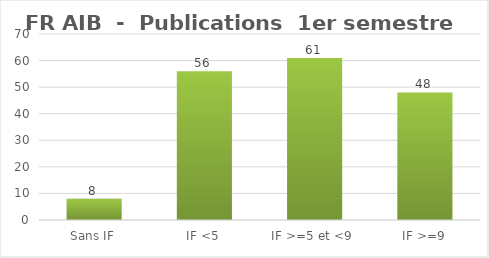
| Category | Series 0 |
|---|---|
| Sans IF | 8 |
| IF <5 | 56 |
| IF >=5 et <9  | 61 |
| IF >=9 | 48 |